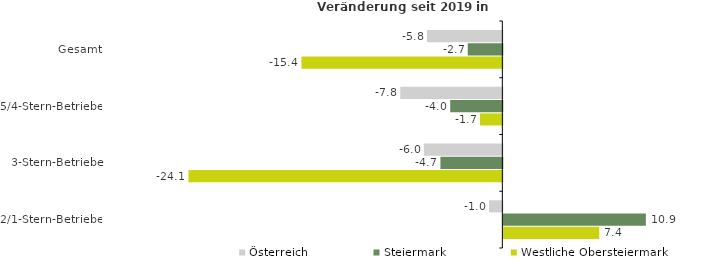
| Category | Österreich | Steiermark | Westliche Obersteiermark |
|---|---|---|---|
| Gesamt | -5.779 | -2.653 | -15.399 |
| 5/4-Stern-Betriebe | -7.825 | -3.996 | -1.718 |
| 3-Stern-Betriebe | -6.014 | -4.748 | -24.06 |
| 2/1-Stern-Betriebe | -1.021 | 10.926 | 7.354 |